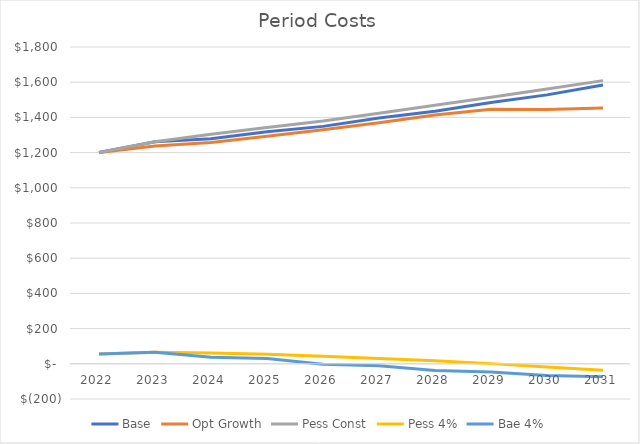
| Category | Base | Opt Growth | Pess Const | Pess 4% | Bae 4% |
|---|---|---|---|---|---|
| 2022.0 | 1201 | 1201 | 1201 | 55 | 55 |
| 2023.0 | 1262 | 1237 | 1262 | 66 | 66 |
| 2024.0 | 1279 | 1257 | 1304 | 61 | 37 |
| 2025.0 | 1319 | 1293 | 1343 | 54 | 30 |
| 2026.0 | 1349 | 1330 | 1379 | 43 | -2 |
| 2027.0 | 1397 | 1370 | 1423 | 30 | -11 |
| 2028.0 | 1435 | 1414 | 1469 | 17 | -38 |
| 2029.0 | 1485 | 1446 | 1515 | 1 | -47 |
| 2030.0 | 1528 | 1445 | 1561 | -18 | -66 |
| 2031.0 | 1584 | 1453 | 1609 | -37 | -73 |